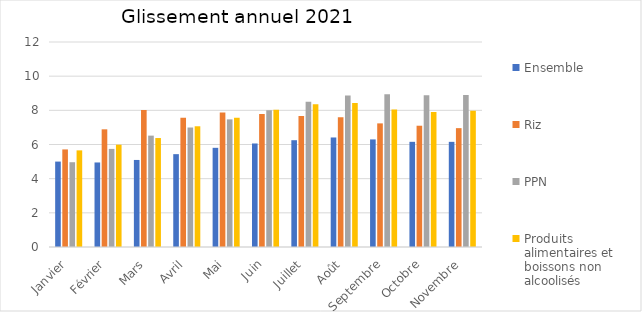
| Category | Ensemble | Riz | PPN | Produits alimentaires et boissons non alcoolisés |
|---|---|---|---|---|
| Janvier | 5 | 5.712 | 4.963 | 5.657 |
| Février | 4.948 | 6.888 | 5.742 | 5.988 |
| Mars | 5.096 | 8.018 | 6.52 | 6.379 |
| Avril | 5.435 | 7.561 | 6.994 | 7.067 |
| Mai | 5.806 | 7.876 | 7.471 | 7.573 |
| Juin | 6.06 | 7.789 | 8.002 | 8.041 |
| Juillet | 6.251 | 7.667 | 8.499 | 8.356 |
| Août | 6.411 | 7.597 | 8.863 | 8.428 |
| Septembre | 6.297 | 7.236 | 8.939 | 8.042 |
| Octobre | 6.157 | 7.099 | 8.878 | 7.907 |
| Novembre | 6.155 | 6.957 | 8.904 | 7.975 |